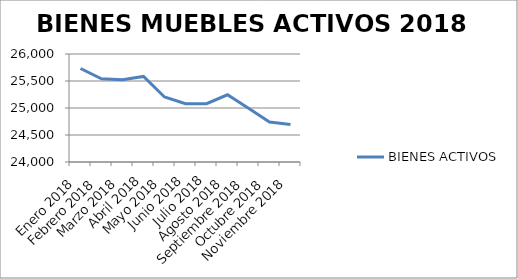
| Category | BIENES ACTIVOS |
|---|---|
| Enero 2018 | 25731 |
| Febrero 2018 | 25541 |
| Marzo 2018 | 25524 |
| Abril 2018 | 25585 |
| Mayo 2018 | 25204 |
| Junio 2018 | 25079 |
| Julio 2018 | 25080 |
| Agosto 2018 | 25245 |
| Septiembre 2018 | 24997 |
| Octubre 2018 | 24740 |
| Noviembre 2018 | 24693 |